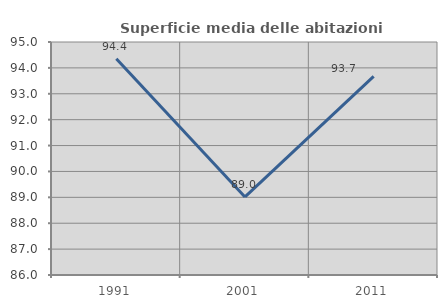
| Category | Superficie media delle abitazioni occupate |
|---|---|
| 1991.0 | 94.354 |
| 2001.0 | 89.015 |
| 2011.0 | 93.675 |